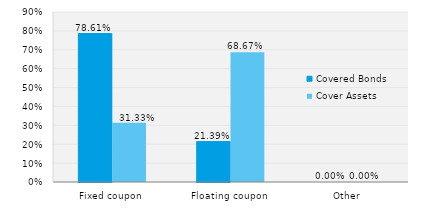
| Category | Covered Bonds | Cover Assets |
|---|---|---|
| Fixed coupon | 0.786 | 0.313 |
| Floating coupon | 0.214 | 0.687 |
| Other | 0 | 0 |